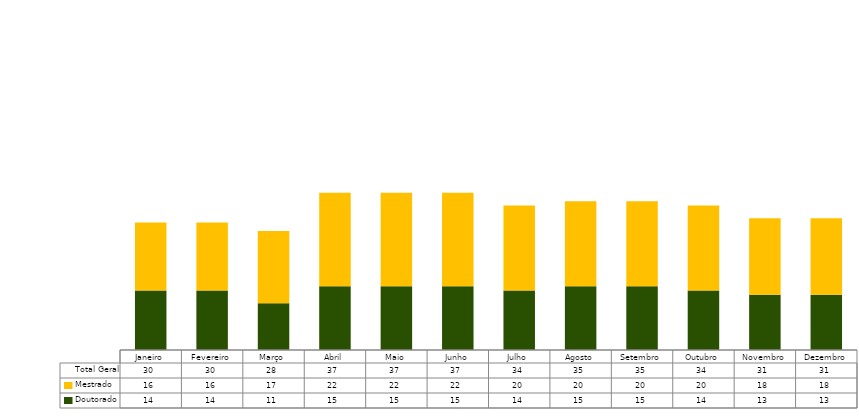
| Category | Doutorado | Mestrado | Total Geral |
|---|---|---|---|
| Janeiro | 14 | 16 | 30 |
| Fevereiro | 14 | 16 | 30 |
| Março | 11 | 17 | 28 |
| Abril | 15 | 22 | 37 |
| Maio | 15 | 22 | 37 |
| Junho | 15 | 22 | 37 |
| Julho | 14 | 20 | 34 |
| Agosto | 15 | 20 | 35 |
| Setembro | 15 | 20 | 35 |
| Outubro | 14 | 20 | 34 |
| Novembro | 13 | 18 | 31 |
| Dezembro | 13 | 18 | 31 |